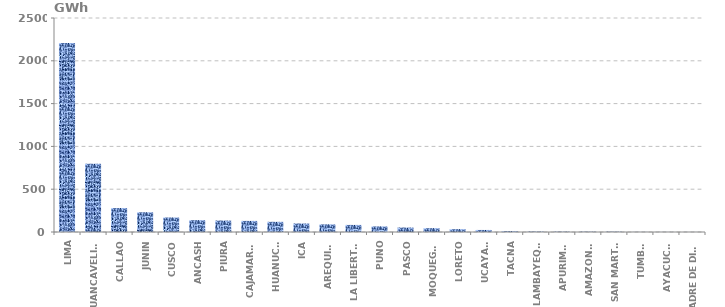
| Category | Series 0 |
|---|---|
| LIMA | 2207.243 |
| HUANCAVELICA | 796.633 |
| CALLAO | 279.763 |
| JUNIN | 230.693 |
| CUSCO | 169.437 |
| ANCASH | 138.332 |
| PIURA | 133.759 |
| CAJAMARCA | 129.629 |
| HUANUCO | 118.92 |
| ICA | 99.185 |
| AREQUIPA | 89.239 |
| LA LIBERTAD | 82.601 |
| PUNO | 65.179 |
| PASCO | 52.096 |
| MOQUEGUA | 44.823 |
| LORETO | 33.251 |
| UCAYALI | 23.882 |
| TACNA | 9.885 |
| LAMBAYEQUE | 5.391 |
| APURIMAC | 4.391 |
| AMAZONAS | 3.958 |
| SAN MARTÍN | 3.95 |
| TUMBES | 1.101 |
| AYACUCHO | 0.856 |
| MADRE DE DIOS | 0.467 |